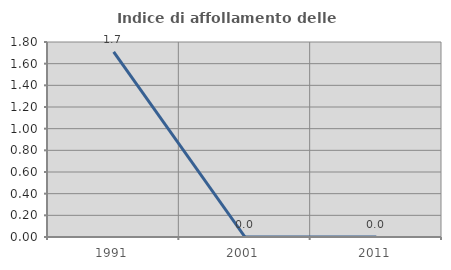
| Category | Indice di affollamento delle abitazioni  |
|---|---|
| 1991.0 | 1.709 |
| 2001.0 | 0 |
| 2011.0 | 0 |